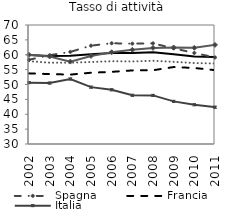
| Category | EU 27 | EU 15 | Germania | Spagna | Francia | Italia |
|---|---|---|---|---|---|---|
| 2002.0 | 57.849 | 59.874 | 59.987 | 58.308 | 53.745 | 50.627 |
| 2003.0 | 57.325 | 59.596 | 59.418 | 59.853 | 53.502 | 50.488 |
| 2004.0 | 57.344 | 59.64 | 57.692 | 60.953 | 53.329 | 51.86 |
| 2005.0 | 57.557 | 60.146 | 59.605 | 63.053 | 53.952 | 49.11 |
| 2006.0 | 57.823 | 60.577 | 60.851 | 63.862 | 54.258 | 48.224 |
| 2007.0 | 57.743 | 60.589 | 61.666 | 63.728 | 54.727 | 46.374 |
| 2008.0 | 57.989 | 60.801 | 62.291 | 63.821 | 54.793 | 46.338 |
| 2009.0 | 57.625 | 60.206 | 62.45 | 62.155 | 55.867 | 44.33 |
| 2010.0 | 57.207 | 59.452 | 62.333 | 60.597 | 55.552 | 43.202 |
| 2011.0 | 57.056 | 59.239 | 63.305 | 59.087 | 54.822 | 42.367 |